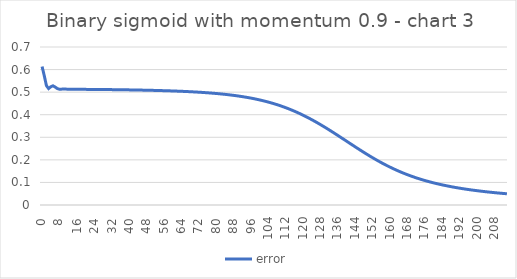
| Category | error |
|---|---|
| 0.0 | 0.613 |
| 1.0 | 0.573 |
| 2.0 | 0.529 |
| 3.0 | 0.516 |
| 4.0 | 0.524 |
| 5.0 | 0.528 |
| 6.0 | 0.523 |
| 7.0 | 0.516 |
| 8.0 | 0.513 |
| 9.0 | 0.513 |
| 10.0 | 0.514 |
| 11.0 | 0.513 |
| 12.0 | 0.513 |
| 13.0 | 0.513 |
| 14.0 | 0.513 |
| 15.0 | 0.513 |
| 16.0 | 0.513 |
| 17.0 | 0.513 |
| 18.0 | 0.512 |
| 19.0 | 0.512 |
| 20.0 | 0.512 |
| 21.0 | 0.512 |
| 22.0 | 0.512 |
| 23.0 | 0.512 |
| 24.0 | 0.512 |
| 25.0 | 0.512 |
| 26.0 | 0.512 |
| 27.0 | 0.512 |
| 28.0 | 0.512 |
| 29.0 | 0.511 |
| 30.0 | 0.511 |
| 31.0 | 0.511 |
| 32.0 | 0.511 |
| 33.0 | 0.511 |
| 34.0 | 0.511 |
| 35.0 | 0.511 |
| 36.0 | 0.511 |
| 37.0 | 0.511 |
| 38.0 | 0.51 |
| 39.0 | 0.51 |
| 40.0 | 0.51 |
| 41.0 | 0.51 |
| 42.0 | 0.51 |
| 43.0 | 0.51 |
| 44.0 | 0.509 |
| 45.0 | 0.509 |
| 46.0 | 0.509 |
| 47.0 | 0.509 |
| 48.0 | 0.509 |
| 49.0 | 0.508 |
| 50.0 | 0.508 |
| 51.0 | 0.508 |
| 52.0 | 0.508 |
| 53.0 | 0.507 |
| 54.0 | 0.507 |
| 55.0 | 0.507 |
| 56.0 | 0.507 |
| 57.0 | 0.506 |
| 58.0 | 0.506 |
| 59.0 | 0.506 |
| 60.0 | 0.505 |
| 61.0 | 0.505 |
| 62.0 | 0.505 |
| 63.0 | 0.504 |
| 64.0 | 0.504 |
| 65.0 | 0.503 |
| 66.0 | 0.503 |
| 67.0 | 0.502 |
| 68.0 | 0.502 |
| 69.0 | 0.501 |
| 70.0 | 0.501 |
| 71.0 | 0.5 |
| 72.0 | 0.5 |
| 73.0 | 0.499 |
| 74.0 | 0.499 |
| 75.0 | 0.498 |
| 76.0 | 0.497 |
| 77.0 | 0.497 |
| 78.0 | 0.496 |
| 79.0 | 0.495 |
| 80.0 | 0.494 |
| 81.0 | 0.493 |
| 82.0 | 0.492 |
| 83.0 | 0.491 |
| 84.0 | 0.49 |
| 85.0 | 0.489 |
| 86.0 | 0.488 |
| 87.0 | 0.487 |
| 88.0 | 0.486 |
| 89.0 | 0.485 |
| 90.0 | 0.483 |
| 91.0 | 0.482 |
| 92.0 | 0.48 |
| 93.0 | 0.479 |
| 94.0 | 0.477 |
| 95.0 | 0.476 |
| 96.0 | 0.474 |
| 97.0 | 0.472 |
| 98.0 | 0.47 |
| 99.0 | 0.468 |
| 100.0 | 0.466 |
| 101.0 | 0.464 |
| 102.0 | 0.461 |
| 103.0 | 0.459 |
| 104.0 | 0.456 |
| 105.0 | 0.454 |
| 106.0 | 0.451 |
| 107.0 | 0.448 |
| 108.0 | 0.445 |
| 109.0 | 0.442 |
| 110.0 | 0.439 |
| 111.0 | 0.435 |
| 112.0 | 0.432 |
| 113.0 | 0.428 |
| 114.0 | 0.424 |
| 115.0 | 0.42 |
| 116.0 | 0.416 |
| 117.0 | 0.412 |
| 118.0 | 0.408 |
| 119.0 | 0.403 |
| 120.0 | 0.399 |
| 121.0 | 0.394 |
| 122.0 | 0.389 |
| 123.0 | 0.384 |
| 124.0 | 0.379 |
| 125.0 | 0.374 |
| 126.0 | 0.368 |
| 127.0 | 0.363 |
| 128.0 | 0.357 |
| 129.0 | 0.351 |
| 130.0 | 0.346 |
| 131.0 | 0.34 |
| 132.0 | 0.334 |
| 133.0 | 0.328 |
| 134.0 | 0.322 |
| 135.0 | 0.315 |
| 136.0 | 0.309 |
| 137.0 | 0.303 |
| 138.0 | 0.297 |
| 139.0 | 0.29 |
| 140.0 | 0.284 |
| 141.0 | 0.278 |
| 142.0 | 0.271 |
| 143.0 | 0.265 |
| 144.0 | 0.259 |
| 145.0 | 0.252 |
| 146.0 | 0.246 |
| 147.0 | 0.24 |
| 148.0 | 0.234 |
| 149.0 | 0.228 |
| 150.0 | 0.222 |
| 151.0 | 0.216 |
| 152.0 | 0.21 |
| 153.0 | 0.205 |
| 154.0 | 0.199 |
| 155.0 | 0.194 |
| 156.0 | 0.189 |
| 157.0 | 0.183 |
| 158.0 | 0.178 |
| 159.0 | 0.173 |
| 160.0 | 0.169 |
| 161.0 | 0.164 |
| 162.0 | 0.159 |
| 163.0 | 0.155 |
| 164.0 | 0.151 |
| 165.0 | 0.147 |
| 166.0 | 0.143 |
| 167.0 | 0.139 |
| 168.0 | 0.135 |
| 169.0 | 0.131 |
| 170.0 | 0.128 |
| 171.0 | 0.124 |
| 172.0 | 0.121 |
| 173.0 | 0.118 |
| 174.0 | 0.115 |
| 175.0 | 0.112 |
| 176.0 | 0.109 |
| 177.0 | 0.106 |
| 178.0 | 0.104 |
| 179.0 | 0.101 |
| 180.0 | 0.099 |
| 181.0 | 0.096 |
| 182.0 | 0.094 |
| 183.0 | 0.092 |
| 184.0 | 0.09 |
| 185.0 | 0.088 |
| 186.0 | 0.086 |
| 187.0 | 0.084 |
| 188.0 | 0.082 |
| 189.0 | 0.08 |
| 190.0 | 0.078 |
| 191.0 | 0.077 |
| 192.0 | 0.075 |
| 193.0 | 0.073 |
| 194.0 | 0.072 |
| 195.0 | 0.07 |
| 196.0 | 0.069 |
| 197.0 | 0.068 |
| 198.0 | 0.066 |
| 199.0 | 0.065 |
| 200.0 | 0.064 |
| 201.0 | 0.063 |
| 202.0 | 0.061 |
| 203.0 | 0.06 |
| 204.0 | 0.059 |
| 205.0 | 0.058 |
| 206.0 | 0.057 |
| 207.0 | 0.056 |
| 208.0 | 0.055 |
| 209.0 | 0.054 |
| 210.0 | 0.053 |
| 211.0 | 0.052 |
| 212.0 | 0.051 |
| 213.0 | 0.051 |
| 214.0 | 0.05 |